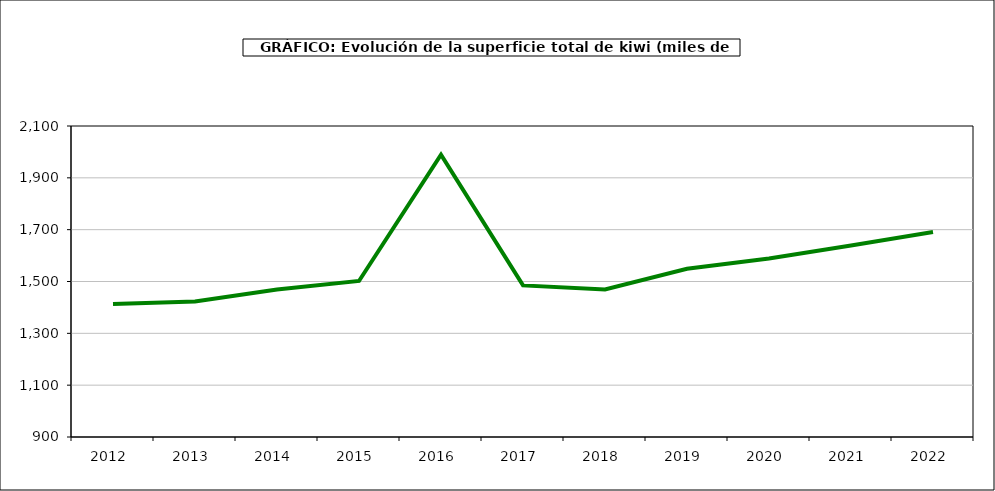
| Category | superficie kiwi |
|---|---|
| 2012.0 | 1413 |
| 2013.0 | 1423 |
| 2014.0 | 1469 |
| 2015.0 | 1502 |
| 2016.0 | 1989 |
| 2017.0 | 1485 |
| 2018.0 | 1469 |
| 2019.0 | 1549 |
| 2020.0 | 1589 |
| 2021.0 | 1639 |
| 2022.0 | 1691 |